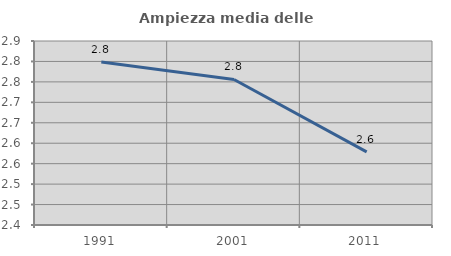
| Category | Ampiezza media delle famiglie |
|---|---|
| 1991.0 | 2.799 |
| 2001.0 | 2.756 |
| 2011.0 | 2.579 |